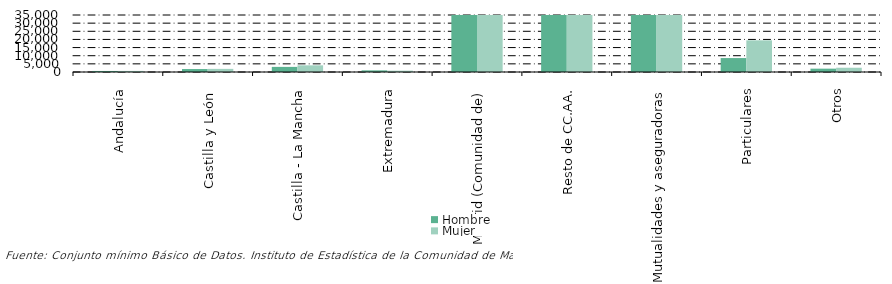
| Category | Hombre | Mujer |
|---|---|---|
| Andalucía | 645 | 672 |
| Castilla y León  | 1821 | 1918 |
| Castilla - La Mancha | 3138 | 4095 |
| Extremadura | 1008 | 821 |
| Madrid (Comunidad de) | 494711 | 590151 |
| Resto de CC.AA. | 222041 | 253732 |
| Mutualidades y aseguradoras | 137211 | 158137 |
| Particulares | 8561 | 19448 |
| Otros | 2052 | 2609 |